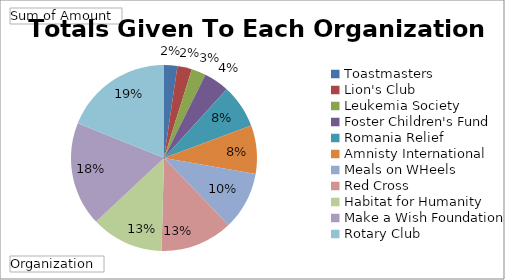
| Category | Total |
|---|---|
| Toastmasters | 55 |
| Lion's Club | 60 |
| Leukemia Society | 60 |
| Foster Children's Fund | 105 |
| Romania Relief | 180 |
| Amnisty International | 200 |
| Meals on WHeels | 240 |
| Red Cross | 300 |
| Habitat for Humanity | 300 |
| Make a Wish Foundation | 430 |
| Rotary Club | 450 |